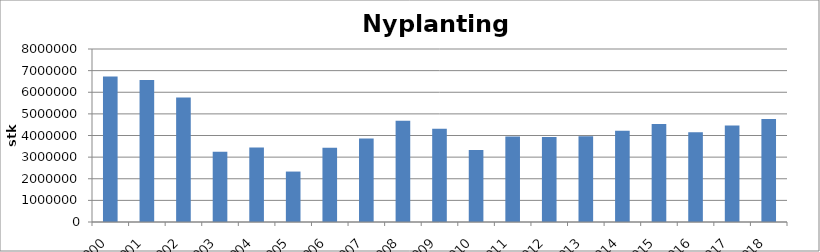
| Category | Totalt |
|---|---|
| 2000 | 6732339 |
| 2001 | 6565732 |
| 2002 | 5753362 |
| 2003 | 3247881 |
| 2004 | 3441786 |
| 2005 | 2332451 |
| 2006 | 3438789 |
| 2007 | 3865257 |
| 2008 | 4679386 |
| 2009 | 4310742 |
| 2010 | 3331957 |
| 2011 | 3950774 |
| 2012 | 3935614 |
| 2013 | 3968517 |
| 2014 | 4224114 |
| 2015 | 4533047 |
| 2016 | 4149937 |
| 2017 | 4462482 |
| 2018 | 4763920 |